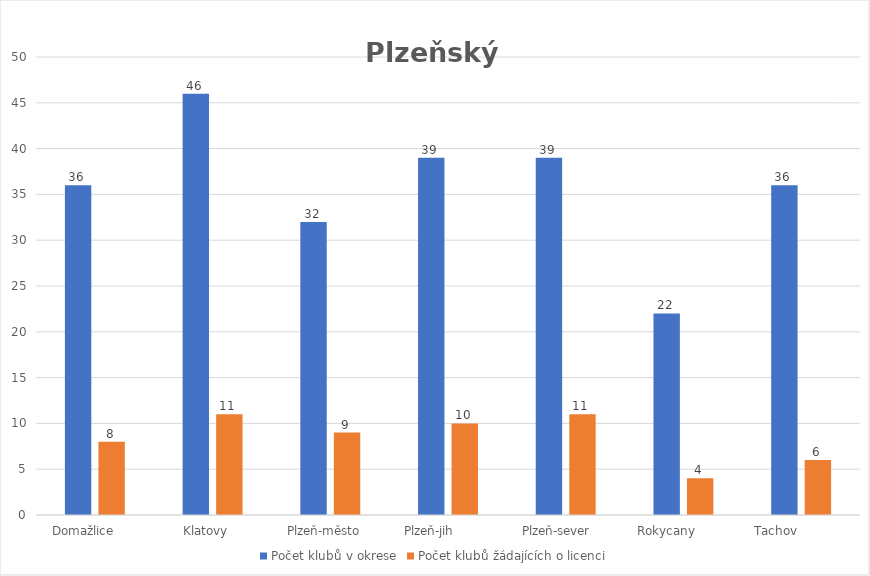
| Category | Počet klubů v okrese | Počet klubů žádajících o licenci |
|---|---|---|
| Domažlice      | 36 | 8 |
| Klatovy    | 46 | 11 |
| Plzeň-město   | 32 | 9 |
| Plzeň-jih          | 39 | 10 |
| Plzeň-sever     | 39 | 11 |
| Rokycany         | 22 | 4 |
| Tachov             | 36 | 6 |